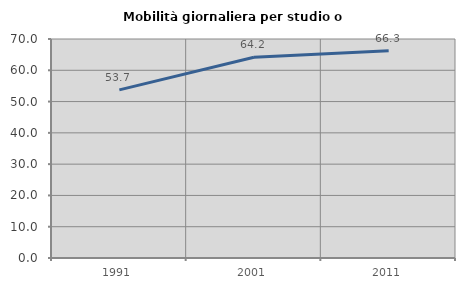
| Category | Mobilità giornaliera per studio o lavoro |
|---|---|
| 1991.0 | 53.747 |
| 2001.0 | 64.17 |
| 2011.0 | 66.282 |